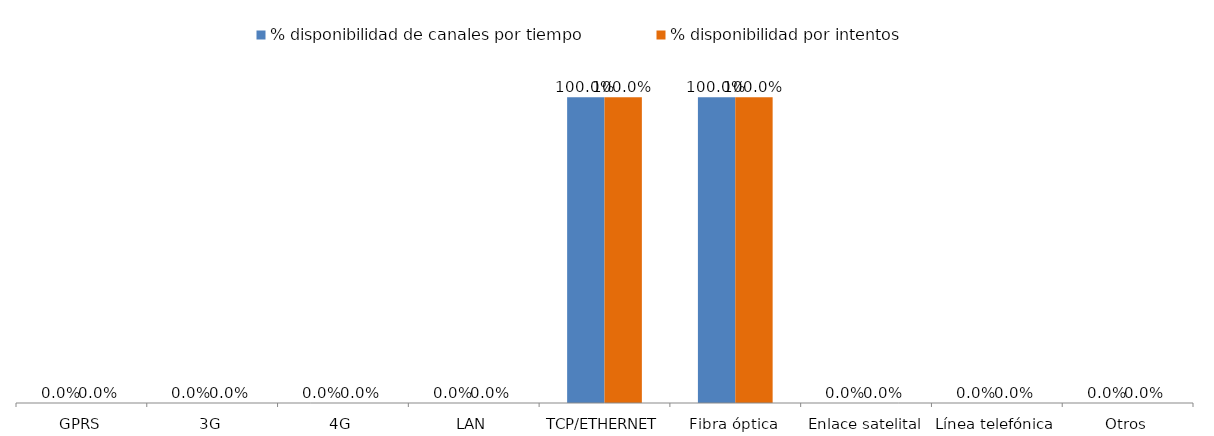
| Category | % disponibilidad de canales por tiempo | % disponibilidad por intentos |
|---|---|---|
| GPRS | 0 | 0 |
| 3G | 0 | 0 |
| 4G | 0 | 0 |
| LAN | 0 | 0 |
| TCP/ETHERNET | 1 | 1 |
| Fibra óptica | 1 | 1 |
| Enlace satelital | 0 | 0 |
| Línea telefónica | 0 | 0 |
| Otros | 0 | 0 |